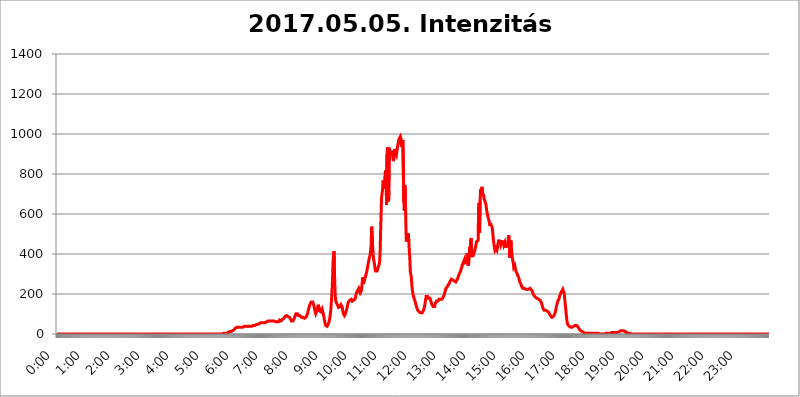
| Category | 2017.05.05. Intenzitás [W/m^2] |
|---|---|
| 0.0 | 0 |
| 0.0006944444444444445 | 0 |
| 0.001388888888888889 | 0 |
| 0.0020833333333333333 | 0 |
| 0.002777777777777778 | 0 |
| 0.003472222222222222 | 0 |
| 0.004166666666666667 | 0 |
| 0.004861111111111111 | 0 |
| 0.005555555555555556 | 0 |
| 0.0062499999999999995 | 0 |
| 0.006944444444444444 | 0 |
| 0.007638888888888889 | 0 |
| 0.008333333333333333 | 0 |
| 0.009027777777777779 | 0 |
| 0.009722222222222222 | 0 |
| 0.010416666666666666 | 0 |
| 0.011111111111111112 | 0 |
| 0.011805555555555555 | 0 |
| 0.012499999999999999 | 0 |
| 0.013194444444444444 | 0 |
| 0.013888888888888888 | 0 |
| 0.014583333333333332 | 0 |
| 0.015277777777777777 | 0 |
| 0.015972222222222224 | 0 |
| 0.016666666666666666 | 0 |
| 0.017361111111111112 | 0 |
| 0.018055555555555557 | 0 |
| 0.01875 | 0 |
| 0.019444444444444445 | 0 |
| 0.02013888888888889 | 0 |
| 0.020833333333333332 | 0 |
| 0.02152777777777778 | 0 |
| 0.022222222222222223 | 0 |
| 0.02291666666666667 | 0 |
| 0.02361111111111111 | 0 |
| 0.024305555555555556 | 0 |
| 0.024999999999999998 | 0 |
| 0.025694444444444447 | 0 |
| 0.02638888888888889 | 0 |
| 0.027083333333333334 | 0 |
| 0.027777777777777776 | 0 |
| 0.02847222222222222 | 0 |
| 0.029166666666666664 | 0 |
| 0.029861111111111113 | 0 |
| 0.030555555555555555 | 0 |
| 0.03125 | 0 |
| 0.03194444444444445 | 0 |
| 0.03263888888888889 | 0 |
| 0.03333333333333333 | 0 |
| 0.034027777777777775 | 0 |
| 0.034722222222222224 | 0 |
| 0.035416666666666666 | 0 |
| 0.036111111111111115 | 0 |
| 0.03680555555555556 | 0 |
| 0.0375 | 0 |
| 0.03819444444444444 | 0 |
| 0.03888888888888889 | 0 |
| 0.03958333333333333 | 0 |
| 0.04027777777777778 | 0 |
| 0.04097222222222222 | 0 |
| 0.041666666666666664 | 0 |
| 0.042361111111111106 | 0 |
| 0.04305555555555556 | 0 |
| 0.043750000000000004 | 0 |
| 0.044444444444444446 | 0 |
| 0.04513888888888889 | 0 |
| 0.04583333333333334 | 0 |
| 0.04652777777777778 | 0 |
| 0.04722222222222222 | 0 |
| 0.04791666666666666 | 0 |
| 0.04861111111111111 | 0 |
| 0.049305555555555554 | 0 |
| 0.049999999999999996 | 0 |
| 0.05069444444444445 | 0 |
| 0.051388888888888894 | 0 |
| 0.052083333333333336 | 0 |
| 0.05277777777777778 | 0 |
| 0.05347222222222222 | 0 |
| 0.05416666666666667 | 0 |
| 0.05486111111111111 | 0 |
| 0.05555555555555555 | 0 |
| 0.05625 | 0 |
| 0.05694444444444444 | 0 |
| 0.057638888888888885 | 0 |
| 0.05833333333333333 | 0 |
| 0.05902777777777778 | 0 |
| 0.059722222222222225 | 0 |
| 0.06041666666666667 | 0 |
| 0.061111111111111116 | 0 |
| 0.06180555555555556 | 0 |
| 0.0625 | 0 |
| 0.06319444444444444 | 0 |
| 0.06388888888888888 | 0 |
| 0.06458333333333334 | 0 |
| 0.06527777777777778 | 0 |
| 0.06597222222222222 | 0 |
| 0.06666666666666667 | 0 |
| 0.06736111111111111 | 0 |
| 0.06805555555555555 | 0 |
| 0.06874999999999999 | 0 |
| 0.06944444444444443 | 0 |
| 0.07013888888888889 | 0 |
| 0.07083333333333333 | 0 |
| 0.07152777777777779 | 0 |
| 0.07222222222222223 | 0 |
| 0.07291666666666667 | 0 |
| 0.07361111111111111 | 0 |
| 0.07430555555555556 | 0 |
| 0.075 | 0 |
| 0.07569444444444444 | 0 |
| 0.0763888888888889 | 0 |
| 0.07708333333333334 | 0 |
| 0.07777777777777778 | 0 |
| 0.07847222222222222 | 0 |
| 0.07916666666666666 | 0 |
| 0.0798611111111111 | 0 |
| 0.08055555555555556 | 0 |
| 0.08125 | 0 |
| 0.08194444444444444 | 0 |
| 0.08263888888888889 | 0 |
| 0.08333333333333333 | 0 |
| 0.08402777777777777 | 0 |
| 0.08472222222222221 | 0 |
| 0.08541666666666665 | 0 |
| 0.08611111111111112 | 0 |
| 0.08680555555555557 | 0 |
| 0.08750000000000001 | 0 |
| 0.08819444444444445 | 0 |
| 0.08888888888888889 | 0 |
| 0.08958333333333333 | 0 |
| 0.09027777777777778 | 0 |
| 0.09097222222222222 | 0 |
| 0.09166666666666667 | 0 |
| 0.09236111111111112 | 0 |
| 0.09305555555555556 | 0 |
| 0.09375 | 0 |
| 0.09444444444444444 | 0 |
| 0.09513888888888888 | 0 |
| 0.09583333333333333 | 0 |
| 0.09652777777777777 | 0 |
| 0.09722222222222222 | 0 |
| 0.09791666666666667 | 0 |
| 0.09861111111111111 | 0 |
| 0.09930555555555555 | 0 |
| 0.09999999999999999 | 0 |
| 0.10069444444444443 | 0 |
| 0.1013888888888889 | 0 |
| 0.10208333333333335 | 0 |
| 0.10277777777777779 | 0 |
| 0.10347222222222223 | 0 |
| 0.10416666666666667 | 0 |
| 0.10486111111111111 | 0 |
| 0.10555555555555556 | 0 |
| 0.10625 | 0 |
| 0.10694444444444444 | 0 |
| 0.1076388888888889 | 0 |
| 0.10833333333333334 | 0 |
| 0.10902777777777778 | 0 |
| 0.10972222222222222 | 0 |
| 0.1111111111111111 | 0 |
| 0.11180555555555556 | 0 |
| 0.11180555555555556 | 0 |
| 0.1125 | 0 |
| 0.11319444444444444 | 0 |
| 0.11388888888888889 | 0 |
| 0.11458333333333333 | 0 |
| 0.11527777777777777 | 0 |
| 0.11597222222222221 | 0 |
| 0.11666666666666665 | 0 |
| 0.1173611111111111 | 0 |
| 0.11805555555555557 | 0 |
| 0.11944444444444445 | 0 |
| 0.12013888888888889 | 0 |
| 0.12083333333333333 | 0 |
| 0.12152777777777778 | 0 |
| 0.12222222222222223 | 0 |
| 0.12291666666666667 | 0 |
| 0.12291666666666667 | 0 |
| 0.12361111111111112 | 0 |
| 0.12430555555555556 | 0 |
| 0.125 | 0 |
| 0.12569444444444444 | 0 |
| 0.12638888888888888 | 0 |
| 0.12708333333333333 | 0 |
| 0.16875 | 0 |
| 0.12847222222222224 | 0 |
| 0.12916666666666668 | 0 |
| 0.12986111111111112 | 0 |
| 0.13055555555555556 | 0 |
| 0.13125 | 0 |
| 0.13194444444444445 | 0 |
| 0.1326388888888889 | 0 |
| 0.13333333333333333 | 0 |
| 0.13402777777777777 | 0 |
| 0.13402777777777777 | 0 |
| 0.13472222222222222 | 0 |
| 0.13541666666666666 | 0 |
| 0.1361111111111111 | 0 |
| 0.13749999999999998 | 0 |
| 0.13819444444444443 | 0 |
| 0.1388888888888889 | 0 |
| 0.13958333333333334 | 0 |
| 0.14027777777777778 | 0 |
| 0.14097222222222222 | 0 |
| 0.14166666666666666 | 0 |
| 0.1423611111111111 | 0 |
| 0.14305555555555557 | 0 |
| 0.14375000000000002 | 0 |
| 0.14444444444444446 | 0 |
| 0.1451388888888889 | 0 |
| 0.1451388888888889 | 0 |
| 0.14652777777777778 | 0 |
| 0.14722222222222223 | 0 |
| 0.14791666666666667 | 0 |
| 0.1486111111111111 | 0 |
| 0.14930555555555555 | 0 |
| 0.15 | 0 |
| 0.15069444444444444 | 0 |
| 0.15138888888888888 | 0 |
| 0.15208333333333332 | 0 |
| 0.15277777777777776 | 0 |
| 0.15347222222222223 | 0 |
| 0.15416666666666667 | 0 |
| 0.15486111111111112 | 0 |
| 0.15555555555555556 | 0 |
| 0.15625 | 0 |
| 0.15694444444444444 | 0 |
| 0.15763888888888888 | 0 |
| 0.15833333333333333 | 0 |
| 0.15902777777777777 | 0 |
| 0.15972222222222224 | 0 |
| 0.16041666666666668 | 0 |
| 0.16111111111111112 | 0 |
| 0.16180555555555556 | 0 |
| 0.1625 | 0 |
| 0.16319444444444445 | 0 |
| 0.1638888888888889 | 0 |
| 0.16458333333333333 | 0 |
| 0.16527777777777777 | 0 |
| 0.16597222222222222 | 0 |
| 0.16666666666666666 | 0 |
| 0.1673611111111111 | 0 |
| 0.16805555555555554 | 0 |
| 0.16874999999999998 | 0 |
| 0.16944444444444443 | 0 |
| 0.17013888888888887 | 0 |
| 0.1708333333333333 | 0 |
| 0.17152777777777775 | 0 |
| 0.17222222222222225 | 0 |
| 0.1729166666666667 | 0 |
| 0.17361111111111113 | 0 |
| 0.17430555555555557 | 0 |
| 0.17500000000000002 | 0 |
| 0.17569444444444446 | 0 |
| 0.1763888888888889 | 0 |
| 0.17708333333333334 | 0 |
| 0.17777777777777778 | 0 |
| 0.17847222222222223 | 0 |
| 0.17916666666666667 | 0 |
| 0.1798611111111111 | 0 |
| 0.18055555555555555 | 0 |
| 0.18125 | 0 |
| 0.18194444444444444 | 0 |
| 0.1826388888888889 | 0 |
| 0.18333333333333335 | 0 |
| 0.1840277777777778 | 0 |
| 0.18472222222222223 | 0 |
| 0.18541666666666667 | 0 |
| 0.18611111111111112 | 0 |
| 0.18680555555555556 | 0 |
| 0.1875 | 0 |
| 0.18819444444444444 | 0 |
| 0.18888888888888888 | 0 |
| 0.18958333333333333 | 0 |
| 0.19027777777777777 | 0 |
| 0.1909722222222222 | 0 |
| 0.19166666666666665 | 0 |
| 0.19236111111111112 | 0 |
| 0.19305555555555554 | 0 |
| 0.19375 | 0 |
| 0.19444444444444445 | 0 |
| 0.1951388888888889 | 0 |
| 0.19583333333333333 | 0 |
| 0.19652777777777777 | 0 |
| 0.19722222222222222 | 0 |
| 0.19791666666666666 | 0 |
| 0.1986111111111111 | 0 |
| 0.19930555555555554 | 0 |
| 0.19999999999999998 | 0 |
| 0.20069444444444443 | 0 |
| 0.20138888888888887 | 0 |
| 0.2020833333333333 | 0 |
| 0.2027777777777778 | 0 |
| 0.2034722222222222 | 0 |
| 0.2041666666666667 | 0 |
| 0.20486111111111113 | 0 |
| 0.20555555555555557 | 0 |
| 0.20625000000000002 | 0 |
| 0.20694444444444446 | 0 |
| 0.2076388888888889 | 0 |
| 0.20833333333333334 | 0 |
| 0.20902777777777778 | 0 |
| 0.20972222222222223 | 0 |
| 0.21041666666666667 | 0 |
| 0.2111111111111111 | 0 |
| 0.21180555555555555 | 0 |
| 0.2125 | 0 |
| 0.21319444444444444 | 0 |
| 0.2138888888888889 | 0 |
| 0.21458333333333335 | 0 |
| 0.2152777777777778 | 0 |
| 0.21597222222222223 | 0 |
| 0.21666666666666667 | 0 |
| 0.21736111111111112 | 0 |
| 0.21805555555555556 | 0 |
| 0.21875 | 0 |
| 0.21944444444444444 | 0 |
| 0.22013888888888888 | 0 |
| 0.22083333333333333 | 0 |
| 0.22152777777777777 | 0 |
| 0.2222222222222222 | 0 |
| 0.22291666666666665 | 0 |
| 0.2236111111111111 | 0 |
| 0.22430555555555556 | 0 |
| 0.225 | 0 |
| 0.22569444444444445 | 0 |
| 0.2263888888888889 | 0 |
| 0.22708333333333333 | 0 |
| 0.22777777777777777 | 0 |
| 0.22847222222222222 | 0 |
| 0.22916666666666666 | 0 |
| 0.2298611111111111 | 0 |
| 0.23055555555555554 | 0 |
| 0.23124999999999998 | 0 |
| 0.23194444444444443 | 0 |
| 0.23263888888888887 | 3.525 |
| 0.2333333333333333 | 3.525 |
| 0.2340277777777778 | 3.525 |
| 0.2347222222222222 | 3.525 |
| 0.2354166666666667 | 3.525 |
| 0.23611111111111113 | 3.525 |
| 0.23680555555555557 | 3.525 |
| 0.23750000000000002 | 3.525 |
| 0.23819444444444446 | 3.525 |
| 0.2388888888888889 | 7.887 |
| 0.23958333333333334 | 7.887 |
| 0.24027777777777778 | 7.887 |
| 0.24097222222222223 | 12.257 |
| 0.24166666666666667 | 12.257 |
| 0.2423611111111111 | 12.257 |
| 0.24305555555555555 | 12.257 |
| 0.24375 | 12.257 |
| 0.24444444444444446 | 16.636 |
| 0.24513888888888888 | 16.636 |
| 0.24583333333333335 | 16.636 |
| 0.2465277777777778 | 21.024 |
| 0.24722222222222223 | 21.024 |
| 0.24791666666666667 | 21.024 |
| 0.24861111111111112 | 25.419 |
| 0.24930555555555556 | 25.419 |
| 0.25 | 29.823 |
| 0.25069444444444444 | 29.823 |
| 0.2513888888888889 | 29.823 |
| 0.2520833333333333 | 34.234 |
| 0.25277777777777777 | 34.234 |
| 0.2534722222222222 | 34.234 |
| 0.25416666666666665 | 34.234 |
| 0.2548611111111111 | 34.234 |
| 0.2555555555555556 | 34.234 |
| 0.25625000000000003 | 34.234 |
| 0.2569444444444445 | 34.234 |
| 0.2576388888888889 | 34.234 |
| 0.25833333333333336 | 34.234 |
| 0.2590277777777778 | 34.234 |
| 0.25972222222222224 | 34.234 |
| 0.2604166666666667 | 34.234 |
| 0.2611111111111111 | 34.234 |
| 0.26180555555555557 | 34.234 |
| 0.2625 | 38.653 |
| 0.26319444444444445 | 38.653 |
| 0.2638888888888889 | 38.653 |
| 0.26458333333333334 | 38.653 |
| 0.2652777777777778 | 38.653 |
| 0.2659722222222222 | 38.653 |
| 0.26666666666666666 | 38.653 |
| 0.2673611111111111 | 38.653 |
| 0.26805555555555555 | 38.653 |
| 0.26875 | 38.653 |
| 0.26944444444444443 | 38.653 |
| 0.2701388888888889 | 38.653 |
| 0.2708333333333333 | 38.653 |
| 0.27152777777777776 | 38.653 |
| 0.2722222222222222 | 38.653 |
| 0.27291666666666664 | 38.653 |
| 0.2736111111111111 | 38.653 |
| 0.2743055555555555 | 38.653 |
| 0.27499999999999997 | 43.079 |
| 0.27569444444444446 | 43.079 |
| 0.27638888888888885 | 43.079 |
| 0.27708333333333335 | 43.079 |
| 0.2777777777777778 | 47.511 |
| 0.27847222222222223 | 47.511 |
| 0.2791666666666667 | 47.511 |
| 0.2798611111111111 | 47.511 |
| 0.28055555555555556 | 47.511 |
| 0.28125 | 47.511 |
| 0.28194444444444444 | 47.511 |
| 0.2826388888888889 | 51.951 |
| 0.2833333333333333 | 51.951 |
| 0.28402777777777777 | 51.951 |
| 0.2847222222222222 | 51.951 |
| 0.28541666666666665 | 56.398 |
| 0.28611111111111115 | 56.398 |
| 0.28680555555555554 | 56.398 |
| 0.28750000000000003 | 56.398 |
| 0.2881944444444445 | 56.398 |
| 0.2888888888888889 | 56.398 |
| 0.28958333333333336 | 56.398 |
| 0.2902777777777778 | 56.398 |
| 0.29097222222222224 | 56.398 |
| 0.2916666666666667 | 56.398 |
| 0.2923611111111111 | 56.398 |
| 0.29305555555555557 | 56.398 |
| 0.29375 | 60.85 |
| 0.29444444444444445 | 60.85 |
| 0.2951388888888889 | 60.85 |
| 0.29583333333333334 | 65.31 |
| 0.2965277777777778 | 65.31 |
| 0.2972222222222222 | 65.31 |
| 0.29791666666666666 | 65.31 |
| 0.2986111111111111 | 65.31 |
| 0.29930555555555555 | 65.31 |
| 0.3 | 65.31 |
| 0.30069444444444443 | 65.31 |
| 0.3013888888888889 | 65.31 |
| 0.3020833333333333 | 65.31 |
| 0.30277777777777776 | 65.31 |
| 0.3034722222222222 | 65.31 |
| 0.30416666666666664 | 65.31 |
| 0.3048611111111111 | 65.31 |
| 0.3055555555555555 | 65.31 |
| 0.30624999999999997 | 60.85 |
| 0.3069444444444444 | 60.85 |
| 0.3076388888888889 | 60.85 |
| 0.30833333333333335 | 60.85 |
| 0.3090277777777778 | 60.85 |
| 0.30972222222222223 | 60.85 |
| 0.3104166666666667 | 60.85 |
| 0.3111111111111111 | 60.85 |
| 0.31180555555555556 | 69.775 |
| 0.3125 | 65.31 |
| 0.31319444444444444 | 65.31 |
| 0.3138888888888889 | 65.31 |
| 0.3145833333333333 | 69.775 |
| 0.31527777777777777 | 69.775 |
| 0.3159722222222222 | 74.246 |
| 0.31666666666666665 | 74.246 |
| 0.31736111111111115 | 78.722 |
| 0.31805555555555554 | 78.722 |
| 0.31875000000000003 | 83.205 |
| 0.3194444444444445 | 87.692 |
| 0.3201388888888889 | 87.692 |
| 0.32083333333333336 | 87.692 |
| 0.3215277777777778 | 92.184 |
| 0.32222222222222224 | 92.184 |
| 0.3229166666666667 | 92.184 |
| 0.3236111111111111 | 87.692 |
| 0.32430555555555557 | 87.692 |
| 0.325 | 83.205 |
| 0.32569444444444445 | 83.205 |
| 0.3263888888888889 | 78.722 |
| 0.32708333333333334 | 74.246 |
| 0.3277777777777778 | 69.775 |
| 0.3284722222222222 | 65.31 |
| 0.32916666666666666 | 65.31 |
| 0.3298611111111111 | 60.85 |
| 0.33055555555555555 | 65.31 |
| 0.33125 | 65.31 |
| 0.33194444444444443 | 74.246 |
| 0.3326388888888889 | 78.722 |
| 0.3333333333333333 | 87.692 |
| 0.3340277777777778 | 92.184 |
| 0.3347222222222222 | 101.184 |
| 0.3354166666666667 | 101.184 |
| 0.3361111111111111 | 101.184 |
| 0.3368055555555556 | 101.184 |
| 0.33749999999999997 | 96.682 |
| 0.33819444444444446 | 92.184 |
| 0.33888888888888885 | 92.184 |
| 0.33958333333333335 | 92.184 |
| 0.34027777777777773 | 92.184 |
| 0.34097222222222223 | 87.692 |
| 0.3416666666666666 | 87.692 |
| 0.3423611111111111 | 83.205 |
| 0.3430555555555555 | 83.205 |
| 0.34375 | 78.722 |
| 0.3444444444444445 | 83.205 |
| 0.3451388888888889 | 83.205 |
| 0.3458333333333334 | 78.722 |
| 0.34652777777777777 | 78.722 |
| 0.34722222222222227 | 78.722 |
| 0.34791666666666665 | 78.722 |
| 0.34861111111111115 | 83.205 |
| 0.34930555555555554 | 87.692 |
| 0.35000000000000003 | 92.184 |
| 0.3506944444444444 | 96.682 |
| 0.3513888888888889 | 105.69 |
| 0.3520833333333333 | 119.235 |
| 0.3527777777777778 | 128.284 |
| 0.3534722222222222 | 137.347 |
| 0.3541666666666667 | 141.884 |
| 0.3548611111111111 | 150.964 |
| 0.35555555555555557 | 155.509 |
| 0.35625 | 160.056 |
| 0.35694444444444445 | 164.605 |
| 0.3576388888888889 | 164.605 |
| 0.35833333333333334 | 160.056 |
| 0.3590277777777778 | 155.509 |
| 0.3597222222222222 | 146.423 |
| 0.36041666666666666 | 132.814 |
| 0.3611111111111111 | 119.235 |
| 0.36180555555555555 | 110.201 |
| 0.3625 | 101.184 |
| 0.36319444444444443 | 101.184 |
| 0.3638888888888889 | 105.69 |
| 0.3645833333333333 | 119.235 |
| 0.3652777777777778 | 132.814 |
| 0.3659722222222222 | 146.423 |
| 0.3666666666666667 | 141.884 |
| 0.3673611111111111 | 128.284 |
| 0.3680555555555556 | 114.716 |
| 0.36874999999999997 | 110.201 |
| 0.36944444444444446 | 110.201 |
| 0.37013888888888885 | 110.201 |
| 0.37083333333333335 | 114.716 |
| 0.37152777777777773 | 123.758 |
| 0.37222222222222223 | 119.235 |
| 0.3729166666666666 | 105.69 |
| 0.3736111111111111 | 92.184 |
| 0.3743055555555555 | 78.722 |
| 0.375 | 65.31 |
| 0.3756944444444445 | 51.951 |
| 0.3763888888888889 | 43.079 |
| 0.3770833333333334 | 38.653 |
| 0.37777777777777777 | 38.653 |
| 0.37847222222222227 | 38.653 |
| 0.37916666666666665 | 38.653 |
| 0.37986111111111115 | 47.511 |
| 0.38055555555555554 | 51.951 |
| 0.38125000000000003 | 60.85 |
| 0.3819444444444444 | 74.246 |
| 0.3826388888888889 | 87.692 |
| 0.3833333333333333 | 110.201 |
| 0.3840277777777778 | 137.347 |
| 0.3847222222222222 | 173.709 |
| 0.3854166666666667 | 219.309 |
| 0.3861111111111111 | 278.603 |
| 0.38680555555555557 | 360.221 |
| 0.3875 | 387.202 |
| 0.38819444444444445 | 414.035 |
| 0.3888888888888889 | 301.354 |
| 0.38958333333333334 | 214.746 |
| 0.3902777777777778 | 173.709 |
| 0.3909722222222222 | 160.056 |
| 0.39166666666666666 | 155.509 |
| 0.3923611111111111 | 155.509 |
| 0.39305555555555555 | 146.423 |
| 0.39375 | 141.884 |
| 0.39444444444444443 | 132.814 |
| 0.3951388888888889 | 132.814 |
| 0.3958333333333333 | 132.814 |
| 0.3965277777777778 | 137.347 |
| 0.3972222222222222 | 141.884 |
| 0.3979166666666667 | 146.423 |
| 0.3986111111111111 | 146.423 |
| 0.3993055555555556 | 137.347 |
| 0.39999999999999997 | 128.284 |
| 0.40069444444444446 | 110.201 |
| 0.40138888888888885 | 101.184 |
| 0.40208333333333335 | 96.682 |
| 0.40277777777777773 | 92.184 |
| 0.40347222222222223 | 96.682 |
| 0.4041666666666666 | 101.184 |
| 0.4048611111111111 | 110.201 |
| 0.4055555555555555 | 119.235 |
| 0.40625 | 128.284 |
| 0.4069444444444445 | 137.347 |
| 0.4076388888888889 | 150.964 |
| 0.4083333333333334 | 160.056 |
| 0.40902777777777777 | 160.056 |
| 0.40972222222222227 | 164.605 |
| 0.41041666666666665 | 169.156 |
| 0.41111111111111115 | 173.709 |
| 0.41180555555555554 | 173.709 |
| 0.41250000000000003 | 173.709 |
| 0.4131944444444444 | 169.156 |
| 0.4138888888888889 | 164.605 |
| 0.4145833333333333 | 169.156 |
| 0.4152777777777778 | 169.156 |
| 0.4159722222222222 | 169.156 |
| 0.4166666666666667 | 169.156 |
| 0.4173611111111111 | 173.709 |
| 0.41805555555555557 | 178.264 |
| 0.41875 | 191.937 |
| 0.41944444444444445 | 201.058 |
| 0.4201388888888889 | 210.182 |
| 0.42083333333333334 | 210.182 |
| 0.4215277777777778 | 219.309 |
| 0.4222222222222222 | 223.873 |
| 0.42291666666666666 | 228.436 |
| 0.4236111111111111 | 223.873 |
| 0.42430555555555555 | 223.873 |
| 0.425 | 205.62 |
| 0.42569444444444443 | 205.62 |
| 0.4263888888888889 | 214.746 |
| 0.4270833333333333 | 233 |
| 0.4277777777777778 | 260.373 |
| 0.4284722222222222 | 283.156 |
| 0.4291666666666667 | 251.251 |
| 0.4298611111111111 | 251.251 |
| 0.4305555555555556 | 264.932 |
| 0.43124999999999997 | 274.047 |
| 0.43194444444444446 | 278.603 |
| 0.43263888888888885 | 292.259 |
| 0.43333333333333335 | 301.354 |
| 0.43402777777777773 | 310.44 |
| 0.43472222222222223 | 324.052 |
| 0.4354166666666666 | 337.639 |
| 0.4361111111111111 | 351.198 |
| 0.4368055555555555 | 364.728 |
| 0.4375 | 378.224 |
| 0.4381944444444445 | 382.715 |
| 0.4388888888888889 | 396.164 |
| 0.4395833333333334 | 418.492 |
| 0.44027777777777777 | 449.551 |
| 0.44097222222222227 | 536.82 |
| 0.44166666666666665 | 536.82 |
| 0.44236111111111115 | 440.702 |
| 0.44305555555555554 | 391.685 |
| 0.44375000000000003 | 373.729 |
| 0.4444444444444444 | 360.221 |
| 0.4451388888888889 | 342.162 |
| 0.4458333333333333 | 324.052 |
| 0.4465277777777778 | 314.98 |
| 0.4472222222222222 | 310.44 |
| 0.4479166666666667 | 310.44 |
| 0.4486111111111111 | 314.98 |
| 0.44930555555555557 | 319.517 |
| 0.45 | 333.113 |
| 0.45069444444444445 | 337.639 |
| 0.4513888888888889 | 346.682 |
| 0.45208333333333334 | 360.221 |
| 0.4527777777777778 | 405.108 |
| 0.4534722222222222 | 506.542 |
| 0.45416666666666666 | 596.45 |
| 0.4548611111111111 | 683.473 |
| 0.45555555555555555 | 687.544 |
| 0.45625 | 719.877 |
| 0.45694444444444443 | 767.62 |
| 0.4576388888888889 | 771.559 |
| 0.4583333333333333 | 767.62 |
| 0.4590277777777778 | 727.896 |
| 0.4597222222222222 | 787.258 |
| 0.4604166666666667 | 818.392 |
| 0.4611111111111111 | 810.641 |
| 0.4618055555555556 | 646.537 |
| 0.46249999999999997 | 898.668 |
| 0.46319444444444446 | 932.576 |
| 0.46388888888888885 | 928.819 |
| 0.46458333333333335 | 663.019 |
| 0.46527777777777773 | 703.762 |
| 0.46597222222222223 | 909.996 |
| 0.4666666666666666 | 917.534 |
| 0.4673611111111111 | 909.996 |
| 0.4680555555555555 | 906.223 |
| 0.46875 | 909.996 |
| 0.4694444444444445 | 909.996 |
| 0.4701388888888889 | 902.447 |
| 0.4708333333333334 | 879.719 |
| 0.47152777777777777 | 864.493 |
| 0.47222222222222227 | 883.516 |
| 0.47291666666666665 | 925.06 |
| 0.47361111111111115 | 928.819 |
| 0.47430555555555554 | 906.223 |
| 0.47500000000000003 | 909.996 |
| 0.4756944444444444 | 894.885 |
| 0.4763888888888889 | 913.766 |
| 0.4770833333333333 | 917.534 |
| 0.4777777777777778 | 947.58 |
| 0.4784722222222222 | 958.814 |
| 0.4791666666666667 | 973.772 |
| 0.4798611111111111 | 977.508 |
| 0.48055555555555557 | 977.508 |
| 0.48125 | 988.714 |
| 0.48194444444444445 | 981.244 |
| 0.4826388888888889 | 936.33 |
| 0.48333333333333334 | 970.034 |
| 0.4840277777777778 | 958.814 |
| 0.4847222222222222 | 970.034 |
| 0.48541666666666666 | 973.772 |
| 0.4861111111111111 | 658.909 |
| 0.48680555555555555 | 617.436 |
| 0.4875 | 743.859 |
| 0.48819444444444443 | 695.666 |
| 0.4888888888888889 | 553.986 |
| 0.4895833333333333 | 462.786 |
| 0.4902777777777778 | 489.108 |
| 0.4909722222222222 | 502.192 |
| 0.4916666666666667 | 489.108 |
| 0.4923611111111111 | 502.192 |
| 0.4930555555555556 | 462.786 |
| 0.49374999999999997 | 414.035 |
| 0.49444444444444446 | 382.715 |
| 0.49513888888888885 | 314.98 |
| 0.49583333333333335 | 296.808 |
| 0.49652777777777773 | 287.709 |
| 0.49722222222222223 | 251.251 |
| 0.4979166666666666 | 223.873 |
| 0.4986111111111111 | 205.62 |
| 0.4993055555555555 | 191.937 |
| 0.5 | 182.82 |
| 0.5006944444444444 | 178.264 |
| 0.5013888888888889 | 169.156 |
| 0.5020833333333333 | 160.056 |
| 0.5027777777777778 | 150.964 |
| 0.5034722222222222 | 141.884 |
| 0.5041666666666667 | 132.814 |
| 0.5048611111111111 | 128.284 |
| 0.5055555555555555 | 119.235 |
| 0.50625 | 119.235 |
| 0.5069444444444444 | 114.716 |
| 0.5076388888888889 | 110.201 |
| 0.5083333333333333 | 110.201 |
| 0.5090277777777777 | 105.69 |
| 0.5097222222222222 | 105.69 |
| 0.5104166666666666 | 101.184 |
| 0.5111111111111112 | 105.69 |
| 0.5118055555555555 | 105.69 |
| 0.5125000000000001 | 110.201 |
| 0.5131944444444444 | 114.716 |
| 0.513888888888889 | 119.235 |
| 0.5145833333333333 | 128.284 |
| 0.5152777777777778 | 141.884 |
| 0.5159722222222222 | 155.509 |
| 0.5166666666666667 | 173.709 |
| 0.517361111111111 | 187.378 |
| 0.5180555555555556 | 191.937 |
| 0.5187499999999999 | 191.937 |
| 0.5194444444444445 | 187.378 |
| 0.5201388888888888 | 182.82 |
| 0.5208333333333334 | 178.264 |
| 0.5215277777777778 | 182.82 |
| 0.5222222222222223 | 182.82 |
| 0.5229166666666667 | 178.264 |
| 0.5236111111111111 | 169.156 |
| 0.5243055555555556 | 160.056 |
| 0.525 | 155.509 |
| 0.5256944444444445 | 146.423 |
| 0.5263888888888889 | 141.884 |
| 0.5270833333333333 | 137.347 |
| 0.5277777777777778 | 137.347 |
| 0.5284722222222222 | 137.347 |
| 0.5291666666666667 | 137.347 |
| 0.5298611111111111 | 146.423 |
| 0.5305555555555556 | 155.509 |
| 0.53125 | 160.056 |
| 0.5319444444444444 | 164.605 |
| 0.5326388888888889 | 164.605 |
| 0.5333333333333333 | 164.605 |
| 0.5340277777777778 | 164.605 |
| 0.5347222222222222 | 169.156 |
| 0.5354166666666667 | 173.709 |
| 0.5361111111111111 | 173.709 |
| 0.5368055555555555 | 173.709 |
| 0.5375 | 173.709 |
| 0.5381944444444444 | 173.709 |
| 0.5388888888888889 | 173.709 |
| 0.5395833333333333 | 173.709 |
| 0.5402777777777777 | 173.709 |
| 0.5409722222222222 | 178.264 |
| 0.5416666666666666 | 187.378 |
| 0.5423611111111112 | 191.937 |
| 0.5430555555555555 | 201.058 |
| 0.5437500000000001 | 210.182 |
| 0.5444444444444444 | 219.309 |
| 0.545138888888889 | 228.436 |
| 0.5458333333333333 | 228.436 |
| 0.5465277777777778 | 233 |
| 0.5472222222222222 | 237.564 |
| 0.5479166666666667 | 242.127 |
| 0.548611111111111 | 246.689 |
| 0.5493055555555556 | 251.251 |
| 0.5499999999999999 | 255.813 |
| 0.5506944444444445 | 260.373 |
| 0.5513888888888888 | 264.932 |
| 0.5520833333333334 | 269.49 |
| 0.5527777777777778 | 274.047 |
| 0.5534722222222223 | 274.047 |
| 0.5541666666666667 | 274.047 |
| 0.5548611111111111 | 269.49 |
| 0.5555555555555556 | 264.932 |
| 0.55625 | 264.932 |
| 0.5569444444444445 | 264.932 |
| 0.5576388888888889 | 260.373 |
| 0.5583333333333333 | 260.373 |
| 0.5590277777777778 | 260.373 |
| 0.5597222222222222 | 264.932 |
| 0.5604166666666667 | 269.49 |
| 0.5611111111111111 | 274.047 |
| 0.5618055555555556 | 278.603 |
| 0.5625 | 287.709 |
| 0.5631944444444444 | 292.259 |
| 0.5638888888888889 | 301.354 |
| 0.5645833333333333 | 305.898 |
| 0.5652777777777778 | 310.44 |
| 0.5659722222222222 | 319.517 |
| 0.5666666666666667 | 324.052 |
| 0.5673611111111111 | 333.113 |
| 0.5680555555555555 | 346.682 |
| 0.56875 | 351.198 |
| 0.5694444444444444 | 355.712 |
| 0.5701388888888889 | 355.712 |
| 0.5708333333333333 | 369.23 |
| 0.5715277777777777 | 355.712 |
| 0.5722222222222222 | 351.198 |
| 0.5729166666666666 | 351.198 |
| 0.5736111111111112 | 360.221 |
| 0.5743055555555555 | 373.729 |
| 0.5750000000000001 | 405.108 |
| 0.5756944444444444 | 351.198 |
| 0.576388888888889 | 342.162 |
| 0.5770833333333333 | 355.712 |
| 0.5777777777777778 | 382.715 |
| 0.5784722222222222 | 436.27 |
| 0.5791666666666667 | 409.574 |
| 0.579861111111111 | 467.187 |
| 0.5805555555555556 | 480.356 |
| 0.5812499999999999 | 391.685 |
| 0.5819444444444445 | 387.202 |
| 0.5826388888888888 | 387.202 |
| 0.5833333333333334 | 391.685 |
| 0.5840277777777778 | 400.638 |
| 0.5847222222222223 | 405.108 |
| 0.5854166666666667 | 414.035 |
| 0.5861111111111111 | 427.39 |
| 0.5868055555555556 | 436.27 |
| 0.5875 | 440.702 |
| 0.5881944444444445 | 462.786 |
| 0.5888888888888889 | 458.38 |
| 0.5895833333333333 | 458.38 |
| 0.5902777777777778 | 467.187 |
| 0.5909722222222222 | 629.948 |
| 0.5916666666666667 | 654.791 |
| 0.5923611111111111 | 506.542 |
| 0.5930555555555556 | 667.123 |
| 0.59375 | 723.889 |
| 0.5944444444444444 | 715.858 |
| 0.5951388888888889 | 711.832 |
| 0.5958333333333333 | 735.89 |
| 0.5965277777777778 | 703.762 |
| 0.5972222222222222 | 707.8 |
| 0.5979166666666667 | 695.666 |
| 0.5986111111111111 | 675.311 |
| 0.5993055555555555 | 671.22 |
| 0.6 | 671.22 |
| 0.6006944444444444 | 654.791 |
| 0.6013888888888889 | 646.537 |
| 0.6020833333333333 | 621.613 |
| 0.6027777777777777 | 609.062 |
| 0.6034722222222222 | 609.062 |
| 0.6041666666666666 | 583.779 |
| 0.6048611111111112 | 575.299 |
| 0.6055555555555555 | 566.793 |
| 0.6062500000000001 | 553.986 |
| 0.6069444444444444 | 541.121 |
| 0.607638888888889 | 553.986 |
| 0.6083333333333333 | 545.416 |
| 0.6090277777777778 | 549.704 |
| 0.6097222222222222 | 536.82 |
| 0.6104166666666667 | 519.555 |
| 0.611111111111111 | 493.475 |
| 0.6118055555555556 | 467.187 |
| 0.6124999999999999 | 449.551 |
| 0.6131944444444445 | 431.833 |
| 0.6138888888888888 | 418.492 |
| 0.6145833333333334 | 422.943 |
| 0.6152777777777778 | 427.39 |
| 0.6159722222222223 | 422.943 |
| 0.6166666666666667 | 418.492 |
| 0.6173611111111111 | 431.833 |
| 0.6180555555555556 | 449.551 |
| 0.61875 | 453.968 |
| 0.6194444444444445 | 471.582 |
| 0.6201388888888889 | 445.129 |
| 0.6208333333333333 | 467.187 |
| 0.6215277777777778 | 458.38 |
| 0.6222222222222222 | 445.129 |
| 0.6229166666666667 | 445.129 |
| 0.6236111111111111 | 458.38 |
| 0.6243055555555556 | 467.187 |
| 0.625 | 445.129 |
| 0.6256944444444444 | 458.38 |
| 0.6263888888888889 | 445.129 |
| 0.6270833333333333 | 440.702 |
| 0.6277777777777778 | 458.38 |
| 0.6284722222222222 | 458.38 |
| 0.6291666666666667 | 431.833 |
| 0.6298611111111111 | 453.968 |
| 0.6305555555555555 | 440.702 |
| 0.63125 | 449.551 |
| 0.6319444444444444 | 458.38 |
| 0.6326388888888889 | 475.972 |
| 0.6333333333333333 | 493.475 |
| 0.6340277777777777 | 493.475 |
| 0.6347222222222222 | 382.715 |
| 0.6354166666666666 | 387.202 |
| 0.6361111111111112 | 467.187 |
| 0.6368055555555555 | 440.702 |
| 0.6375000000000001 | 400.638 |
| 0.6381944444444444 | 387.202 |
| 0.638888888888889 | 364.728 |
| 0.6395833333333333 | 355.712 |
| 0.6402777777777778 | 333.113 |
| 0.6409722222222222 | 337.639 |
| 0.6416666666666667 | 342.162 |
| 0.642361111111111 | 328.584 |
| 0.6430555555555556 | 319.517 |
| 0.6437499999999999 | 310.44 |
| 0.6444444444444445 | 305.898 |
| 0.6451388888888888 | 301.354 |
| 0.6458333333333334 | 292.259 |
| 0.6465277777777778 | 287.709 |
| 0.6472222222222223 | 283.156 |
| 0.6479166666666667 | 278.603 |
| 0.6486111111111111 | 260.373 |
| 0.6493055555555556 | 260.373 |
| 0.65 | 255.813 |
| 0.6506944444444445 | 246.689 |
| 0.6513888888888889 | 237.564 |
| 0.6520833333333333 | 233 |
| 0.6527777777777778 | 228.436 |
| 0.6534722222222222 | 228.436 |
| 0.6541666666666667 | 228.436 |
| 0.6548611111111111 | 228.436 |
| 0.6555555555555556 | 228.436 |
| 0.65625 | 223.873 |
| 0.6569444444444444 | 223.873 |
| 0.6576388888888889 | 223.873 |
| 0.6583333333333333 | 223.873 |
| 0.6590277777777778 | 223.873 |
| 0.6597222222222222 | 228.436 |
| 0.6604166666666667 | 223.873 |
| 0.6611111111111111 | 223.873 |
| 0.6618055555555555 | 228.436 |
| 0.6625 | 228.436 |
| 0.6631944444444444 | 228.436 |
| 0.6638888888888889 | 233 |
| 0.6645833333333333 | 228.436 |
| 0.6652777777777777 | 219.309 |
| 0.6659722222222222 | 219.309 |
| 0.6666666666666666 | 210.182 |
| 0.6673611111111111 | 201.058 |
| 0.6680555555555556 | 196.497 |
| 0.6687500000000001 | 191.937 |
| 0.6694444444444444 | 187.378 |
| 0.6701388888888888 | 187.378 |
| 0.6708333333333334 | 182.82 |
| 0.6715277777777778 | 182.82 |
| 0.6722222222222222 | 178.264 |
| 0.6729166666666666 | 178.264 |
| 0.6736111111111112 | 173.709 |
| 0.6743055555555556 | 173.709 |
| 0.6749999999999999 | 173.709 |
| 0.6756944444444444 | 173.709 |
| 0.6763888888888889 | 173.709 |
| 0.6770833333333334 | 169.156 |
| 0.6777777777777777 | 164.605 |
| 0.6784722222222223 | 164.605 |
| 0.6791666666666667 | 155.509 |
| 0.6798611111111111 | 146.423 |
| 0.6805555555555555 | 137.347 |
| 0.68125 | 128.284 |
| 0.6819444444444445 | 123.758 |
| 0.6826388888888889 | 119.235 |
| 0.6833333333333332 | 119.235 |
| 0.6840277777777778 | 114.716 |
| 0.6847222222222222 | 119.235 |
| 0.6854166666666667 | 119.235 |
| 0.686111111111111 | 114.716 |
| 0.6868055555555556 | 114.716 |
| 0.6875 | 110.201 |
| 0.6881944444444444 | 110.201 |
| 0.688888888888889 | 110.201 |
| 0.6895833333333333 | 105.69 |
| 0.6902777777777778 | 101.184 |
| 0.6909722222222222 | 101.184 |
| 0.6916666666666668 | 92.184 |
| 0.6923611111111111 | 92.184 |
| 0.6930555555555555 | 87.692 |
| 0.69375 | 83.205 |
| 0.6944444444444445 | 83.205 |
| 0.6951388888888889 | 83.205 |
| 0.6958333333333333 | 87.692 |
| 0.6965277777777777 | 92.184 |
| 0.6972222222222223 | 96.682 |
| 0.6979166666666666 | 101.184 |
| 0.6986111111111111 | 110.201 |
| 0.6993055555555556 | 123.758 |
| 0.7000000000000001 | 137.347 |
| 0.7006944444444444 | 146.423 |
| 0.7013888888888888 | 155.509 |
| 0.7020833333333334 | 164.605 |
| 0.7027777777777778 | 169.156 |
| 0.7034722222222222 | 173.709 |
| 0.7041666666666666 | 182.82 |
| 0.7048611111111112 | 191.937 |
| 0.7055555555555556 | 196.497 |
| 0.7062499999999999 | 205.62 |
| 0.7069444444444444 | 210.182 |
| 0.7076388888888889 | 214.746 |
| 0.7083333333333334 | 214.746 |
| 0.7090277777777777 | 223.873 |
| 0.7097222222222223 | 228.436 |
| 0.7104166666666667 | 219.309 |
| 0.7111111111111111 | 201.058 |
| 0.7118055555555555 | 173.709 |
| 0.7125 | 146.423 |
| 0.7131944444444445 | 123.758 |
| 0.7138888888888889 | 96.682 |
| 0.7145833333333332 | 74.246 |
| 0.7152777777777778 | 56.398 |
| 0.7159722222222222 | 47.511 |
| 0.7166666666666667 | 47.511 |
| 0.717361111111111 | 43.079 |
| 0.7180555555555556 | 38.653 |
| 0.71875 | 38.653 |
| 0.7194444444444444 | 34.234 |
| 0.720138888888889 | 34.234 |
| 0.7208333333333333 | 29.823 |
| 0.7215277777777778 | 34.234 |
| 0.7222222222222222 | 34.234 |
| 0.7229166666666668 | 34.234 |
| 0.7236111111111111 | 38.653 |
| 0.7243055555555555 | 38.653 |
| 0.725 | 43.079 |
| 0.7256944444444445 | 43.079 |
| 0.7263888888888889 | 43.079 |
| 0.7270833333333333 | 43.079 |
| 0.7277777777777777 | 43.079 |
| 0.7284722222222223 | 43.079 |
| 0.7291666666666666 | 38.653 |
| 0.7298611111111111 | 38.653 |
| 0.7305555555555556 | 34.234 |
| 0.7312500000000001 | 29.823 |
| 0.7319444444444444 | 25.419 |
| 0.7326388888888888 | 21.024 |
| 0.7333333333333334 | 21.024 |
| 0.7340277777777778 | 16.636 |
| 0.7347222222222222 | 16.636 |
| 0.7354166666666666 | 12.257 |
| 0.7361111111111112 | 12.257 |
| 0.7368055555555556 | 12.257 |
| 0.7374999999999999 | 7.887 |
| 0.7381944444444444 | 7.887 |
| 0.7388888888888889 | 7.887 |
| 0.7395833333333334 | 3.525 |
| 0.7402777777777777 | 3.525 |
| 0.7409722222222223 | 3.525 |
| 0.7416666666666667 | 3.525 |
| 0.7423611111111111 | 3.525 |
| 0.7430555555555555 | 3.525 |
| 0.74375 | 3.525 |
| 0.7444444444444445 | 3.525 |
| 0.7451388888888889 | 3.525 |
| 0.7458333333333332 | 3.525 |
| 0.7465277777777778 | 3.525 |
| 0.7472222222222222 | 3.525 |
| 0.7479166666666667 | 3.525 |
| 0.748611111111111 | 3.525 |
| 0.7493055555555556 | 3.525 |
| 0.75 | 3.525 |
| 0.7506944444444444 | 3.525 |
| 0.751388888888889 | 3.525 |
| 0.7520833333333333 | 3.525 |
| 0.7527777777777778 | 3.525 |
| 0.7534722222222222 | 3.525 |
| 0.7541666666666668 | 3.525 |
| 0.7548611111111111 | 3.525 |
| 0.7555555555555555 | 3.525 |
| 0.75625 | 3.525 |
| 0.7569444444444445 | 3.525 |
| 0.7576388888888889 | 3.525 |
| 0.7583333333333333 | 3.525 |
| 0.7590277777777777 | 3.525 |
| 0.7597222222222223 | 0 |
| 0.7604166666666666 | 0 |
| 0.7611111111111111 | 0 |
| 0.7618055555555556 | 0 |
| 0.7625000000000001 | 0 |
| 0.7631944444444444 | 0 |
| 0.7638888888888888 | 0 |
| 0.7645833333333334 | 0 |
| 0.7652777777777778 | 0 |
| 0.7659722222222222 | 0 |
| 0.7666666666666666 | 0 |
| 0.7673611111111112 | 0 |
| 0.7680555555555556 | 3.525 |
| 0.7687499999999999 | 0 |
| 0.7694444444444444 | 3.525 |
| 0.7701388888888889 | 3.525 |
| 0.7708333333333334 | 3.525 |
| 0.7715277777777777 | 3.525 |
| 0.7722222222222223 | 3.525 |
| 0.7729166666666667 | 3.525 |
| 0.7736111111111111 | 3.525 |
| 0.7743055555555555 | 3.525 |
| 0.775 | 3.525 |
| 0.7756944444444445 | 3.525 |
| 0.7763888888888889 | 3.525 |
| 0.7770833333333332 | 3.525 |
| 0.7777777777777778 | 7.887 |
| 0.7784722222222222 | 7.887 |
| 0.7791666666666667 | 7.887 |
| 0.779861111111111 | 7.887 |
| 0.7805555555555556 | 7.887 |
| 0.78125 | 7.887 |
| 0.7819444444444444 | 7.887 |
| 0.782638888888889 | 7.887 |
| 0.7833333333333333 | 7.887 |
| 0.7840277777777778 | 7.887 |
| 0.7847222222222222 | 7.887 |
| 0.7854166666666668 | 7.887 |
| 0.7861111111111111 | 7.887 |
| 0.7868055555555555 | 12.257 |
| 0.7875 | 12.257 |
| 0.7881944444444445 | 12.257 |
| 0.7888888888888889 | 12.257 |
| 0.7895833333333333 | 12.257 |
| 0.7902777777777777 | 16.636 |
| 0.7909722222222223 | 16.636 |
| 0.7916666666666666 | 16.636 |
| 0.7923611111111111 | 16.636 |
| 0.7930555555555556 | 16.636 |
| 0.7937500000000001 | 21.024 |
| 0.7944444444444444 | 16.636 |
| 0.7951388888888888 | 16.636 |
| 0.7958333333333334 | 12.257 |
| 0.7965277777777778 | 12.257 |
| 0.7972222222222222 | 12.257 |
| 0.7979166666666666 | 12.257 |
| 0.7986111111111112 | 7.887 |
| 0.7993055555555556 | 7.887 |
| 0.7999999999999999 | 3.525 |
| 0.8006944444444444 | 3.525 |
| 0.8013888888888889 | 3.525 |
| 0.8020833333333334 | 3.525 |
| 0.8027777777777777 | 3.525 |
| 0.8034722222222223 | 3.525 |
| 0.8041666666666667 | 0 |
| 0.8048611111111111 | 0 |
| 0.8055555555555555 | 0 |
| 0.80625 | 0 |
| 0.8069444444444445 | 0 |
| 0.8076388888888889 | 0 |
| 0.8083333333333332 | 0 |
| 0.8090277777777778 | 0 |
| 0.8097222222222222 | 0 |
| 0.8104166666666667 | 0 |
| 0.811111111111111 | 0 |
| 0.8118055555555556 | 0 |
| 0.8125 | 0 |
| 0.8131944444444444 | 0 |
| 0.813888888888889 | 0 |
| 0.8145833333333333 | 0 |
| 0.8152777777777778 | 0 |
| 0.8159722222222222 | 0 |
| 0.8166666666666668 | 0 |
| 0.8173611111111111 | 0 |
| 0.8180555555555555 | 0 |
| 0.81875 | 0 |
| 0.8194444444444445 | 0 |
| 0.8201388888888889 | 0 |
| 0.8208333333333333 | 0 |
| 0.8215277777777777 | 0 |
| 0.8222222222222223 | 0 |
| 0.8229166666666666 | 0 |
| 0.8236111111111111 | 0 |
| 0.8243055555555556 | 0 |
| 0.8250000000000001 | 0 |
| 0.8256944444444444 | 0 |
| 0.8263888888888888 | 0 |
| 0.8270833333333334 | 0 |
| 0.8277777777777778 | 0 |
| 0.8284722222222222 | 0 |
| 0.8291666666666666 | 0 |
| 0.8298611111111112 | 0 |
| 0.8305555555555556 | 0 |
| 0.8312499999999999 | 0 |
| 0.8319444444444444 | 0 |
| 0.8326388888888889 | 0 |
| 0.8333333333333334 | 0 |
| 0.8340277777777777 | 0 |
| 0.8347222222222223 | 0 |
| 0.8354166666666667 | 0 |
| 0.8361111111111111 | 0 |
| 0.8368055555555555 | 0 |
| 0.8375 | 0 |
| 0.8381944444444445 | 0 |
| 0.8388888888888889 | 0 |
| 0.8395833333333332 | 0 |
| 0.8402777777777778 | 0 |
| 0.8409722222222222 | 0 |
| 0.8416666666666667 | 0 |
| 0.842361111111111 | 0 |
| 0.8430555555555556 | 0 |
| 0.84375 | 0 |
| 0.8444444444444444 | 0 |
| 0.845138888888889 | 0 |
| 0.8458333333333333 | 0 |
| 0.8465277777777778 | 0 |
| 0.8472222222222222 | 0 |
| 0.8479166666666668 | 0 |
| 0.8486111111111111 | 0 |
| 0.8493055555555555 | 0 |
| 0.85 | 0 |
| 0.8506944444444445 | 0 |
| 0.8513888888888889 | 0 |
| 0.8520833333333333 | 0 |
| 0.8527777777777777 | 0 |
| 0.8534722222222223 | 0 |
| 0.8541666666666666 | 0 |
| 0.8548611111111111 | 0 |
| 0.8555555555555556 | 0 |
| 0.8562500000000001 | 0 |
| 0.8569444444444444 | 0 |
| 0.8576388888888888 | 0 |
| 0.8583333333333334 | 0 |
| 0.8590277777777778 | 0 |
| 0.8597222222222222 | 0 |
| 0.8604166666666666 | 0 |
| 0.8611111111111112 | 0 |
| 0.8618055555555556 | 0 |
| 0.8624999999999999 | 0 |
| 0.8631944444444444 | 0 |
| 0.8638888888888889 | 0 |
| 0.8645833333333334 | 0 |
| 0.8652777777777777 | 0 |
| 0.8659722222222223 | 0 |
| 0.8666666666666667 | 0 |
| 0.8673611111111111 | 0 |
| 0.8680555555555555 | 0 |
| 0.86875 | 0 |
| 0.8694444444444445 | 0 |
| 0.8701388888888889 | 0 |
| 0.8708333333333332 | 0 |
| 0.8715277777777778 | 0 |
| 0.8722222222222222 | 0 |
| 0.8729166666666667 | 0 |
| 0.873611111111111 | 0 |
| 0.8743055555555556 | 0 |
| 0.875 | 0 |
| 0.8756944444444444 | 0 |
| 0.876388888888889 | 0 |
| 0.8770833333333333 | 0 |
| 0.8777777777777778 | 0 |
| 0.8784722222222222 | 0 |
| 0.8791666666666668 | 0 |
| 0.8798611111111111 | 0 |
| 0.8805555555555555 | 0 |
| 0.88125 | 0 |
| 0.8819444444444445 | 0 |
| 0.8826388888888889 | 0 |
| 0.8833333333333333 | 0 |
| 0.8840277777777777 | 0 |
| 0.8847222222222223 | 0 |
| 0.8854166666666666 | 0 |
| 0.8861111111111111 | 0 |
| 0.8868055555555556 | 0 |
| 0.8875000000000001 | 0 |
| 0.8881944444444444 | 0 |
| 0.8888888888888888 | 0 |
| 0.8895833333333334 | 0 |
| 0.8902777777777778 | 0 |
| 0.8909722222222222 | 0 |
| 0.8916666666666666 | 0 |
| 0.8923611111111112 | 0 |
| 0.8930555555555556 | 0 |
| 0.8937499999999999 | 0 |
| 0.8944444444444444 | 0 |
| 0.8951388888888889 | 0 |
| 0.8958333333333334 | 0 |
| 0.8965277777777777 | 0 |
| 0.8972222222222223 | 0 |
| 0.8979166666666667 | 0 |
| 0.8986111111111111 | 0 |
| 0.8993055555555555 | 0 |
| 0.9 | 0 |
| 0.9006944444444445 | 0 |
| 0.9013888888888889 | 0 |
| 0.9020833333333332 | 0 |
| 0.9027777777777778 | 0 |
| 0.9034722222222222 | 0 |
| 0.9041666666666667 | 0 |
| 0.904861111111111 | 0 |
| 0.9055555555555556 | 0 |
| 0.90625 | 0 |
| 0.9069444444444444 | 0 |
| 0.907638888888889 | 0 |
| 0.9083333333333333 | 0 |
| 0.9090277777777778 | 0 |
| 0.9097222222222222 | 0 |
| 0.9104166666666668 | 0 |
| 0.9111111111111111 | 0 |
| 0.9118055555555555 | 0 |
| 0.9125 | 0 |
| 0.9131944444444445 | 0 |
| 0.9138888888888889 | 0 |
| 0.9145833333333333 | 0 |
| 0.9152777777777777 | 0 |
| 0.9159722222222223 | 0 |
| 0.9166666666666666 | 0 |
| 0.9173611111111111 | 0 |
| 0.9180555555555556 | 0 |
| 0.9187500000000001 | 0 |
| 0.9194444444444444 | 0 |
| 0.9201388888888888 | 0 |
| 0.9208333333333334 | 0 |
| 0.9215277777777778 | 0 |
| 0.9222222222222222 | 0 |
| 0.9229166666666666 | 0 |
| 0.9236111111111112 | 0 |
| 0.9243055555555556 | 0 |
| 0.9249999999999999 | 0 |
| 0.9256944444444444 | 0 |
| 0.9263888888888889 | 0 |
| 0.9270833333333334 | 0 |
| 0.9277777777777777 | 0 |
| 0.9284722222222223 | 0 |
| 0.9291666666666667 | 0 |
| 0.9298611111111111 | 0 |
| 0.9305555555555555 | 0 |
| 0.93125 | 0 |
| 0.9319444444444445 | 0 |
| 0.9326388888888889 | 0 |
| 0.9333333333333332 | 0 |
| 0.9340277777777778 | 0 |
| 0.9347222222222222 | 0 |
| 0.9354166666666667 | 0 |
| 0.936111111111111 | 0 |
| 0.9368055555555556 | 0 |
| 0.9375 | 0 |
| 0.9381944444444444 | 0 |
| 0.938888888888889 | 0 |
| 0.9395833333333333 | 0 |
| 0.9402777777777778 | 0 |
| 0.9409722222222222 | 0 |
| 0.9416666666666668 | 0 |
| 0.9423611111111111 | 0 |
| 0.9430555555555555 | 0 |
| 0.94375 | 0 |
| 0.9444444444444445 | 0 |
| 0.9451388888888889 | 0 |
| 0.9458333333333333 | 0 |
| 0.9465277777777777 | 0 |
| 0.9472222222222223 | 0 |
| 0.9479166666666666 | 0 |
| 0.9486111111111111 | 0 |
| 0.9493055555555556 | 0 |
| 0.9500000000000001 | 0 |
| 0.9506944444444444 | 0 |
| 0.9513888888888888 | 0 |
| 0.9520833333333334 | 0 |
| 0.9527777777777778 | 0 |
| 0.9534722222222222 | 0 |
| 0.9541666666666666 | 0 |
| 0.9548611111111112 | 0 |
| 0.9555555555555556 | 0 |
| 0.9562499999999999 | 0 |
| 0.9569444444444444 | 0 |
| 0.9576388888888889 | 0 |
| 0.9583333333333334 | 0 |
| 0.9590277777777777 | 0 |
| 0.9597222222222223 | 0 |
| 0.9604166666666667 | 0 |
| 0.9611111111111111 | 0 |
| 0.9618055555555555 | 0 |
| 0.9625 | 0 |
| 0.9631944444444445 | 0 |
| 0.9638888888888889 | 0 |
| 0.9645833333333332 | 0 |
| 0.9652777777777778 | 0 |
| 0.9659722222222222 | 0 |
| 0.9666666666666667 | 0 |
| 0.967361111111111 | 0 |
| 0.9680555555555556 | 0 |
| 0.96875 | 0 |
| 0.9694444444444444 | 0 |
| 0.970138888888889 | 0 |
| 0.9708333333333333 | 0 |
| 0.9715277777777778 | 0 |
| 0.9722222222222222 | 0 |
| 0.9729166666666668 | 0 |
| 0.9736111111111111 | 0 |
| 0.9743055555555555 | 0 |
| 0.975 | 0 |
| 0.9756944444444445 | 0 |
| 0.9763888888888889 | 0 |
| 0.9770833333333333 | 0 |
| 0.9777777777777777 | 0 |
| 0.9784722222222223 | 0 |
| 0.9791666666666666 | 0 |
| 0.9798611111111111 | 0 |
| 0.9805555555555556 | 0 |
| 0.9812500000000001 | 0 |
| 0.9819444444444444 | 0 |
| 0.9826388888888888 | 0 |
| 0.9833333333333334 | 0 |
| 0.9840277777777778 | 0 |
| 0.9847222222222222 | 0 |
| 0.9854166666666666 | 0 |
| 0.9861111111111112 | 0 |
| 0.9868055555555556 | 0 |
| 0.9874999999999999 | 0 |
| 0.9881944444444444 | 0 |
| 0.9888888888888889 | 0 |
| 0.9895833333333334 | 0 |
| 0.9902777777777777 | 0 |
| 0.9909722222222223 | 0 |
| 0.9916666666666667 | 0 |
| 0.9923611111111111 | 0 |
| 0.9930555555555555 | 0 |
| 0.99375 | 0 |
| 0.9944444444444445 | 0 |
| 0.9951388888888889 | 0 |
| 0.9958333333333332 | 0 |
| 0.9965277777777778 | 0 |
| 0.9972222222222222 | 0 |
| 0.9979166666666667 | 0 |
| 0.998611111111111 | 0 |
| 0.9993055555555556 | 0 |